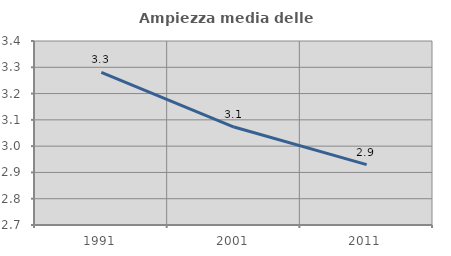
| Category | Ampiezza media delle famiglie |
|---|---|
| 1991.0 | 3.281 |
| 2001.0 | 3.073 |
| 2011.0 | 2.93 |